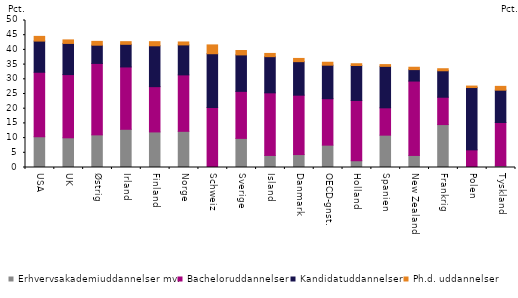
| Category | Erhvervsakademiuddannelser mv. | Bacheloruddannelser | Kandidatuddannelser | Ph.d. uddannelser |
|---|---|---|---|---|
| USA | 10.5 | 21.9 | 10.6 | 1.6 |
| UK | 10.1 | 21.5 | 10.6 | 1.2 |
| Østrig | 11.1 | 24.3 | 6.2 | 1.3 |
| Irland | 13 | 21.2 | 7.7 | 0.9 |
| Finland | 12.1 | 15.4 | 13.9 | 1.4 |
| Norge | 12.3 | 19.2 | 10.2 | 1 |
| Schweiz | 0 | 20.4 | 18.3 | 3 |
| Sverige | 9.9 | 16 | 12.4 | 1.5 |
| Island | 4.1 | 21.3 | 12.3 | 1.1 |
| Danmark | 4.4 | 20.2 | 11.4 | 1.1 |
| OECD-gnst. | 7.6 | 15.8 | 11.4 | 1 |
| Holland | 2.3 | 20.5 | 11.9 | 0.6 |
| Spanien | 11 | 9.3 | 14.1 | 0.6 |
| New Zealand | 4.1 | 25.3 | 3.9 | 0.8 |
| Frankrig | 14.6 | 9.3 | 9 | 0.7 |
| Polen | 0.1 | 5.9 | 21.2 | 0.5 |
| Tyskland | 0.6 | 14.7 | 11 | 1.3 |